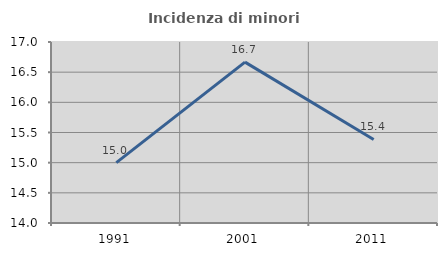
| Category | Incidenza di minori stranieri |
|---|---|
| 1991.0 | 15 |
| 2001.0 | 16.667 |
| 2011.0 | 15.385 |